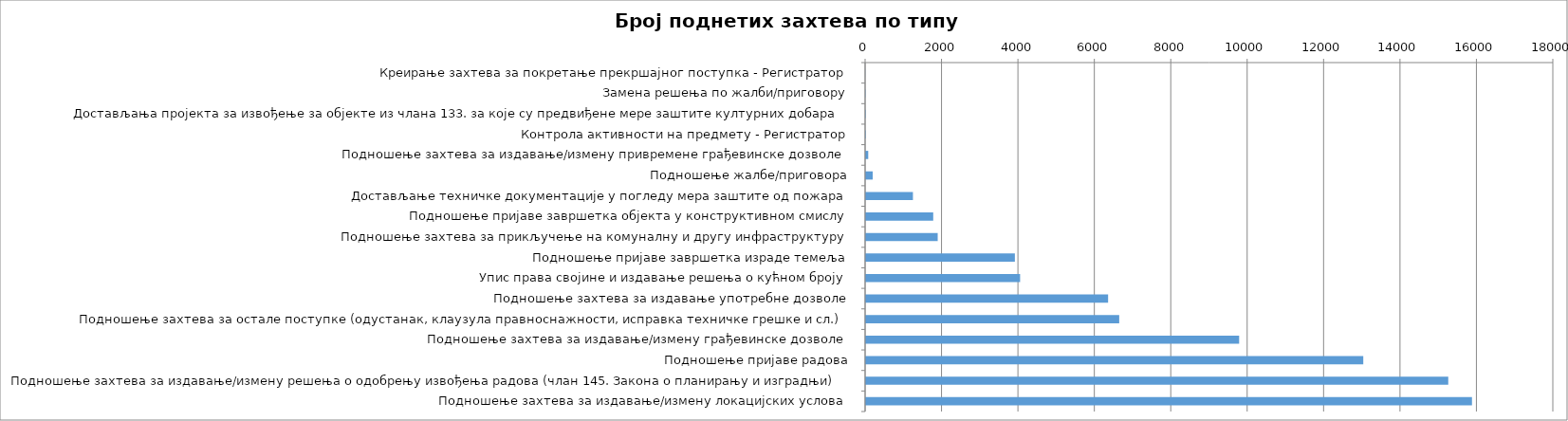
| Category | Број поднетих захтева |
|---|---|
| Креирање захтева за покретање прекршајног поступка - Регистратор | 3 |
| Замена решења по жалби/приговору | 9 |
| Достављања пројекта за извођење за објекте из члана 133. за које су предвиђене мере заштите културних добара | 15 |
| Контрола активности на предмету - Регистратор | 16 |
| Подношење захтева за издавање/измену привремене грађевинске дозволе | 82 |
| Подношење жалбе/приговора | 198 |
| Достављање техничке документације у погледу мера заштите од пожара | 1252 |
| Подношење пријаве завршетка објекта у конструктивном смислу | 1783 |
| Подношење захтева за прикључење на комуналну и другу инфраструктуру | 1900 |
| Подношење пријаве завршетка израде темеља | 3920 |
| Упис права својине и издавање решења о кућном броју | 4057 |
| Подношење захтева за издавање употребне дозволе | 6360 |
| Подношење захтева за остале поступке (одустанак, клаузула правноснажности, исправка техничке грешке и сл.) | 6651 |
| Подношење захтева за издавање/измену грађевинске дозволе | 9790 |
| Подношење пријаве радова | 13039 |
| Подношење захтева за издавање/измену решења о одобрењу извођења радова (члан 145. Закона о планирању и изградњи) | 15263 |
| Подношење захтева за издавање/измену локацијских услова | 15884 |